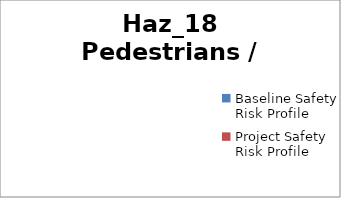
| Category | Haz_18 Pedestrians / Cyclists |
|---|---|
| Baseline Safety Risk Profile | 0 |
| Project Safety Risk Profile | 0 |